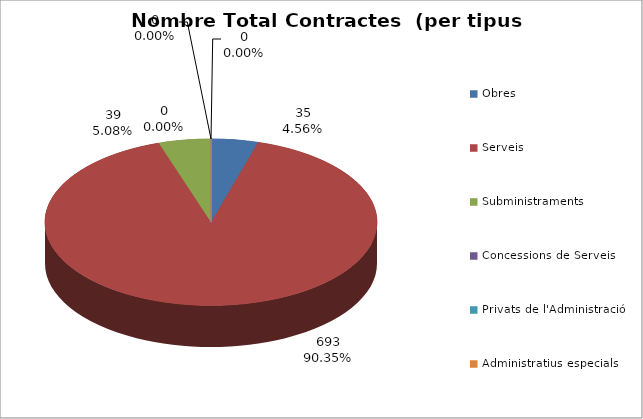
| Category | Nombre Total Contractes |
|---|---|
| Obres | 35 |
| Serveis | 693 |
| Subministraments | 39 |
| Concessions de Serveis | 0 |
| Privats de l'Administració | 0 |
| Administratius especials | 0 |